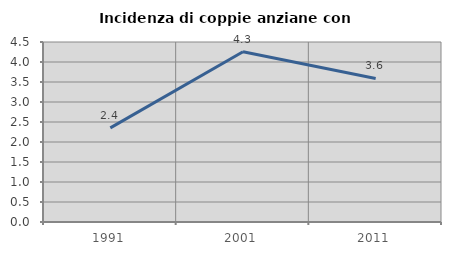
| Category | Incidenza di coppie anziane con figli |
|---|---|
| 1991.0 | 2.353 |
| 2001.0 | 4.255 |
| 2011.0 | 3.59 |